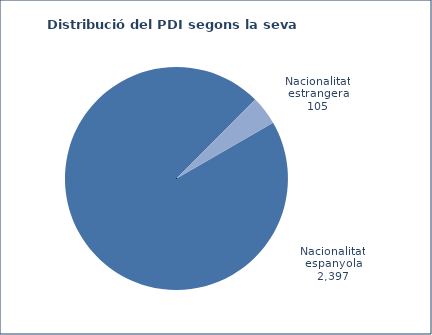
| Category | Series 0 |
|---|---|
| Nacionalitat espanyola | 2397 |
| Nacionalitat estrangera | 105 |